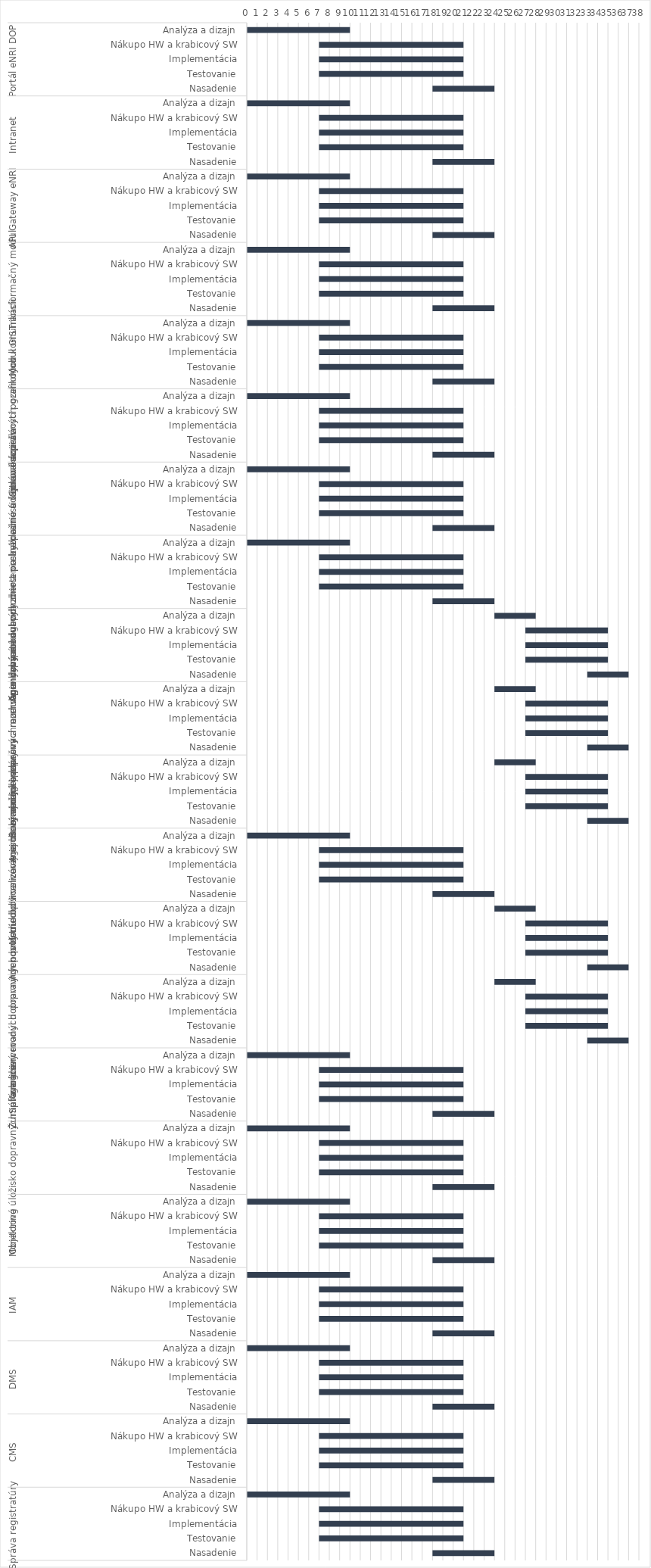
| Category | Series 0 | Series 1 |
|---|---|---|
| 0 | 0 | 10 |
| 1 | 7 | 14 |
| 2 | 7 | 14 |
| 3 | 7 | 14 |
| 4 | 18 | 6 |
| 5 | 0 | 10 |
| 6 | 7 | 14 |
| 7 | 7 | 14 |
| 8 | 7 | 14 |
| 9 | 18 | 6 |
| 10 | 0 | 10 |
| 11 | 7 | 14 |
| 12 | 7 | 14 |
| 13 | 7 | 14 |
| 14 | 18 | 6 |
| 15 | 0 | 10 |
| 16 | 7 | 14 |
| 17 | 7 | 14 |
| 18 | 7 | 14 |
| 19 | 18 | 6 |
| 20 | 0 | 10 |
| 21 | 7 | 14 |
| 22 | 7 | 14 |
| 23 | 7 | 14 |
| 24 | 18 | 6 |
| 25 | 0 | 10 |
| 26 | 7 | 14 |
| 27 | 7 | 14 |
| 28 | 7 | 14 |
| 29 | 18 | 6 |
| 30 | 0 | 10 |
| 31 | 7 | 14 |
| 32 | 7 | 14 |
| 33 | 7 | 14 |
| 34 | 18 | 6 |
| 35 | 0 | 10 |
| 36 | 7 | 14 |
| 37 | 7 | 14 |
| 38 | 7 | 14 |
| 39 | 18 | 6 |
| 40 | 24 | 4 |
| 41 | 27 | 8 |
| 42 | 27 | 8 |
| 43 | 27 | 8 |
| 44 | 33 | 4 |
| 45 | 24 | 4 |
| 46 | 27 | 8 |
| 47 | 27 | 8 |
| 48 | 27 | 8 |
| 49 | 33 | 4 |
| 50 | 24 | 4 |
| 51 | 27 | 8 |
| 52 | 27 | 8 |
| 53 | 27 | 8 |
| 54 | 33 | 4 |
| 55 | 0 | 10 |
| 56 | 7 | 14 |
| 57 | 7 | 14 |
| 58 | 7 | 14 |
| 59 | 18 | 6 |
| 60 | 24 | 4 |
| 61 | 27 | 8 |
| 62 | 27 | 8 |
| 63 | 27 | 8 |
| 64 | 33 | 4 |
| 65 | 24 | 4 |
| 66 | 27 | 8 |
| 67 | 27 | 8 |
| 68 | 27 | 8 |
| 69 | 33 | 4 |
| 70 | 0 | 10 |
| 71 | 7 | 14 |
| 72 | 7 | 14 |
| 73 | 7 | 14 |
| 74 | 18 | 6 |
| 75 | 0 | 10 |
| 76 | 7 | 14 |
| 77 | 7 | 14 |
| 78 | 7 | 14 |
| 79 | 18 | 6 |
| 80 | 0 | 10 |
| 81 | 7 | 14 |
| 82 | 7 | 14 |
| 83 | 7 | 14 |
| 84 | 18 | 6 |
| 85 | 0 | 10 |
| 86 | 7 | 14 |
| 87 | 7 | 14 |
| 88 | 7 | 14 |
| 89 | 18 | 6 |
| 90 | 0 | 10 |
| 91 | 7 | 14 |
| 92 | 7 | 14 |
| 93 | 7 | 14 |
| 94 | 18 | 6 |
| 95 | 0 | 10 |
| 96 | 7 | 14 |
| 97 | 7 | 14 |
| 98 | 7 | 14 |
| 99 | 18 | 6 |
| 100 | 0 | 10 |
| 101 | 7 | 14 |
| 102 | 7 | 14 |
| 103 | 7 | 14 |
| 104 | 18 | 6 |